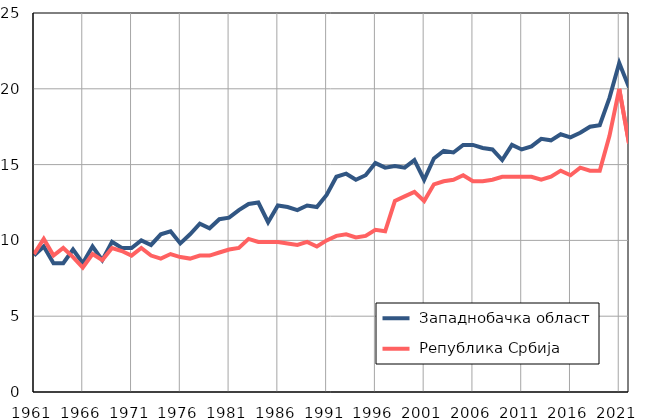
| Category |  Западнобачка област |  Република Србија |
|---|---|---|
| 1961.0 | 9 | 9.1 |
| 1962.0 | 9.6 | 10.1 |
| 1963.0 | 8.5 | 9 |
| 1964.0 | 8.5 | 9.5 |
| 1965.0 | 9.4 | 8.9 |
| 1966.0 | 8.5 | 8.2 |
| 1967.0 | 9.6 | 9.1 |
| 1968.0 | 8.7 | 8.7 |
| 1969.0 | 9.9 | 9.5 |
| 1970.0 | 9.5 | 9.3 |
| 1971.0 | 9.5 | 9 |
| 1972.0 | 10 | 9.5 |
| 1973.0 | 9.7 | 9 |
| 1974.0 | 10.4 | 8.8 |
| 1975.0 | 10.6 | 9.1 |
| 1976.0 | 9.8 | 8.9 |
| 1977.0 | 10.4 | 8.8 |
| 1978.0 | 11.1 | 9 |
| 1979.0 | 10.8 | 9 |
| 1980.0 | 11.4 | 9.2 |
| 1981.0 | 11.5 | 9.4 |
| 1982.0 | 12 | 9.5 |
| 1983.0 | 12.4 | 10.1 |
| 1984.0 | 12.5 | 9.9 |
| 1985.0 | 11.2 | 9.9 |
| 1986.0 | 12.3 | 9.9 |
| 1987.0 | 12.2 | 9.8 |
| 1988.0 | 12 | 9.7 |
| 1989.0 | 12.3 | 9.9 |
| 1990.0 | 12.2 | 9.6 |
| 1991.0 | 13 | 10 |
| 1992.0 | 14.2 | 10.3 |
| 1993.0 | 14.4 | 10.4 |
| 1994.0 | 14 | 10.2 |
| 1995.0 | 14.3 | 10.3 |
| 1996.0 | 15.1 | 10.7 |
| 1997.0 | 14.8 | 10.6 |
| 1998.0 | 14.9 | 12.6 |
| 1999.0 | 14.8 | 12.9 |
| 2000.0 | 15.3 | 13.2 |
| 2001.0 | 14 | 12.6 |
| 2002.0 | 15.4 | 13.7 |
| 2003.0 | 15.9 | 13.9 |
| 2004.0 | 15.8 | 14 |
| 2005.0 | 16.3 | 14.3 |
| 2006.0 | 16.3 | 13.9 |
| 2007.0 | 16.1 | 13.9 |
| 2008.0 | 16 | 14 |
| 2009.0 | 15.3 | 14.2 |
| 2010.0 | 16.3 | 14.2 |
| 2011.0 | 16 | 14.2 |
| 2012.0 | 16.2 | 14.2 |
| 2013.0 | 16.7 | 14 |
| 2014.0 | 16.6 | 14.2 |
| 2015.0 | 17 | 14.6 |
| 2016.0 | 16.8 | 14.3 |
| 2017.0 | 17.1 | 14.8 |
| 2018.0 | 17.5 | 14.6 |
| 2019.0 | 17.6 | 14.6 |
| 2020.0 | 19.4 | 16.9 |
| 2021.0 | 21.7 | 20 |
| 2022.0 | 20.1 | 16.4 |